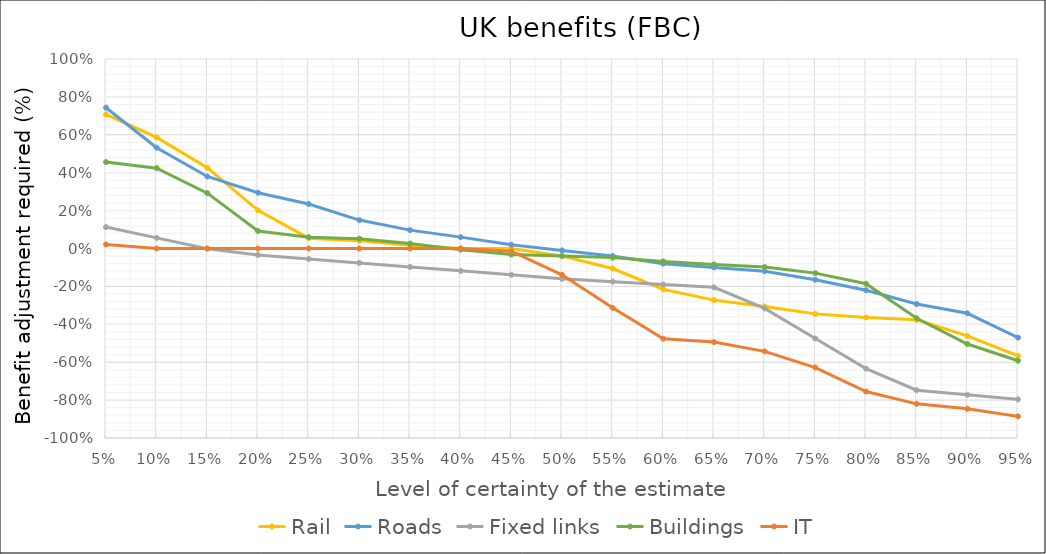
| Category | Rail | Roads | Fixed links | Buildings | IT |
|---|---|---|---|---|---|
| 0.05 | 0.708 | 0.743 | 0.113 | 0.456 | 0.021 |
| 0.1 | 0.586 | 0.532 | 0.056 | 0.424 | 0 |
| 0.15 | 0.426 | 0.38 | -0.001 | 0.292 | 0 |
| 0.2 | 0.202 | 0.294 | -0.034 | 0.092 | 0 |
| 0.25 | 0.055 | 0.235 | -0.055 | 0.06 | 0 |
| 0.3 | 0.041 | 0.15 | -0.076 | 0.052 | 0 |
| 0.35 | 0.017 | 0.097 | -0.097 | 0.026 | 0 |
| 0.4 | 0 | 0.06 | -0.118 | -0.006 | 0 |
| 0.45 | 0 | 0.02 | -0.139 | -0.032 | -0.014 |
| 0.5 | -0.04 | -0.01 | -0.16 | -0.04 | -0.139 |
| 0.55 | -0.105 | -0.04 | -0.175 | -0.048 | -0.313 |
| 0.6 | -0.216 | -0.08 | -0.19 | -0.068 | -0.476 |
| 0.65 | -0.272 | -0.1 | -0.205 | -0.084 | -0.494 |
| 0.7 | -0.306 | -0.12 | -0.316 | -0.098 | -0.543 |
| 0.75 | -0.345 | -0.165 | -0.475 | -0.13 | -0.628 |
| 0.8 | -0.364 | -0.22 | -0.634 | -0.186 | -0.755 |
| 0.85 | -0.376 | -0.293 | -0.748 | -0.368 | -0.82 |
| 0.9 | -0.461 | -0.342 | -0.772 | -0.504 | -0.846 |
| 0.95 | -0.566 | -0.47 | -0.796 | -0.592 | -0.886 |